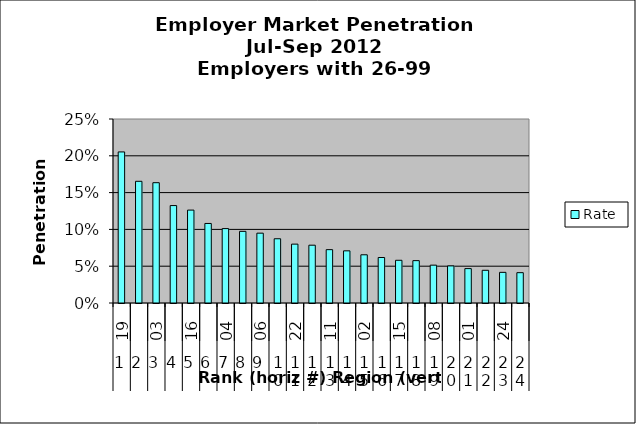
| Category | Rate |
|---|---|
| 0 | 0.205 |
| 1 | 0.165 |
| 2 | 0.163 |
| 3 | 0.132 |
| 4 | 0.126 |
| 5 | 0.108 |
| 6 | 0.101 |
| 7 | 0.097 |
| 8 | 0.095 |
| 9 | 0.087 |
| 10 | 0.08 |
| 11 | 0.079 |
| 12 | 0.072 |
| 13 | 0.071 |
| 14 | 0.066 |
| 15 | 0.062 |
| 16 | 0.058 |
| 17 | 0.058 |
| 18 | 0.051 |
| 19 | 0.05 |
| 20 | 0.047 |
| 21 | 0.044 |
| 22 | 0.042 |
| 23 | 0.041 |